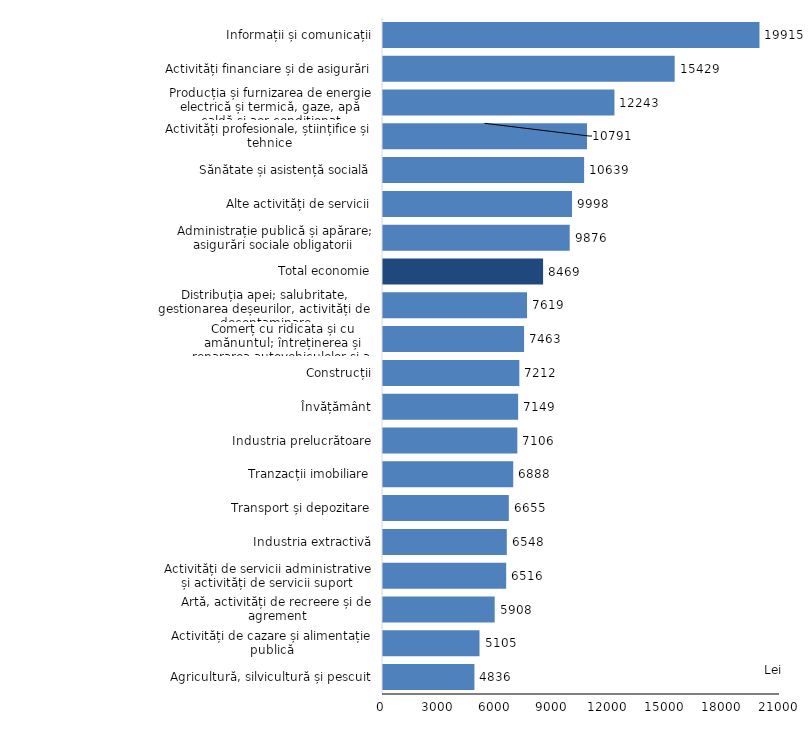
| Category | Series 0 |
|---|---|
| Agricultură, silvicultură și pescuit | 4835.7 |
| Activități de cazare și alimentație publică | 5105 |
| Artă, activități de recreere și de agrement | 5908.4 |
| Activități de servicii administrative și activități de servicii suport | 6516.4 |
| Industria extractivă | 6548.4 |
| Transport și depozitare | 6655.1 |
| Tranzacții imobiliare | 6888.4 |
| Industria prelucrătoare | 7106.2 |
| Învățământ | 7149.2 |
| Construcții | 7211.5 |
| Comerț cu ridicata și cu amănuntul; întreținerea și repararea autovehiculelor și a motocicletelor | 7462.6 |
| Distribuția apei; salubritate, gestionarea deșeurilor, activități de decontaminare | 7618.9 |
| Total economie | 8468.6 |
| Administrație publică și apărare; asigurări sociale obligatorii | 9876.3 |
| Alte activități de servicii | 9998.1 |
| Sănătate și asistență socială | 10639.2 |
| Activități profesionale, științifice și tehnice | 10791.1 |
| Producția și furnizarea de energie electrică și termică, gaze, apă caldă și aer condiționat | 12243 |
| Activități financiare și de asigurări | 15428.9 |
| Informații și comunicații | 19914.5 |